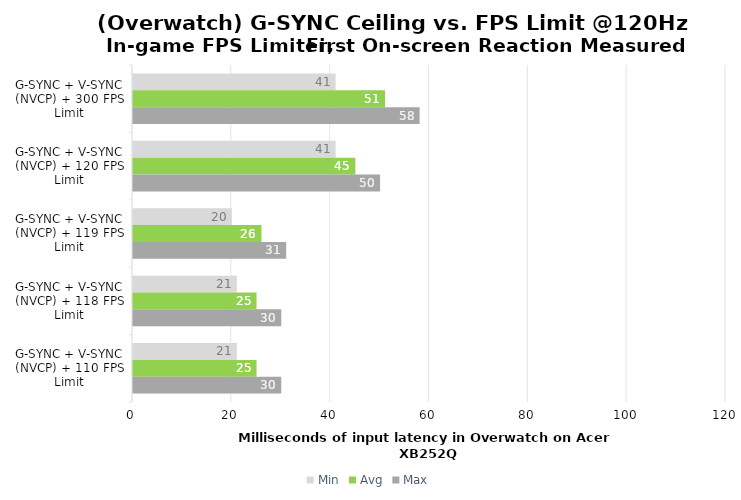
| Category | Min | Avg | Max |
|---|---|---|---|
| G-SYNC + V-SYNC (NVCP) + 300 FPS Limit | 41 | 51 | 58 |
| G-SYNC + V-SYNC (NVCP) + 120 FPS Limit | 41 | 45 | 50 |
| G-SYNC + V-SYNC (NVCP) + 119 FPS Limit | 20 | 26 | 31 |
| G-SYNC + V-SYNC (NVCP) + 118 FPS Limit | 21 | 25 | 30 |
| G-SYNC + V-SYNC (NVCP) + 110 FPS Limit | 21 | 25 | 30 |